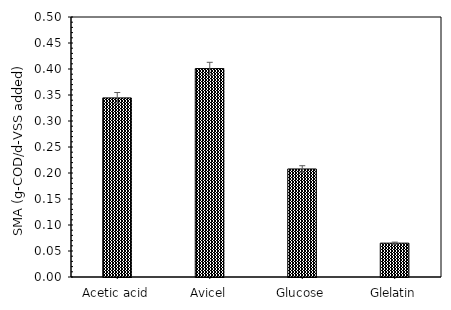
| Category | Series 0 |
|---|---|
| Acetic acid | 0.344 |
| Avicel | 0.401 |
| Glucose | 0.208 |
| Glelatin | 0.065 |